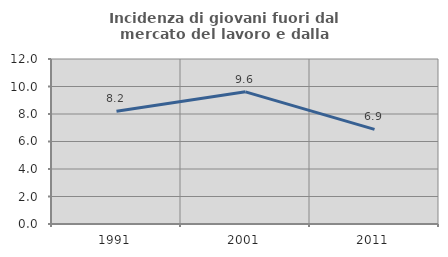
| Category | Incidenza di giovani fuori dal mercato del lavoro e dalla formazione  |
|---|---|
| 1991.0 | 8.2 |
| 2001.0 | 9.612 |
| 2011.0 | 6.882 |